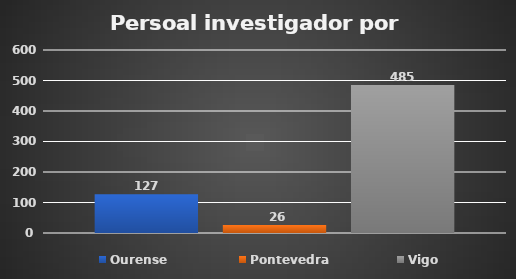
| Category | Ourense | Pontevedra | Vigo |
|---|---|---|---|
| 0 | 127 | 26 | 485 |